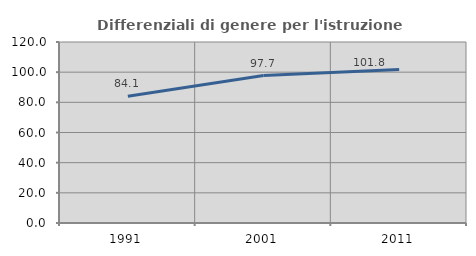
| Category | Differenziali di genere per l'istruzione superiore |
|---|---|
| 1991.0 | 84.052 |
| 2001.0 | 97.739 |
| 2011.0 | 101.772 |